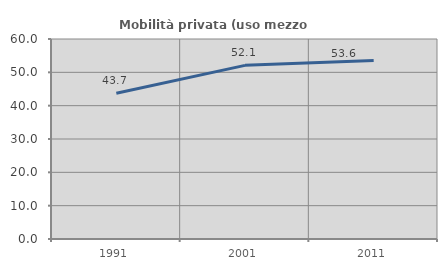
| Category | Mobilità privata (uso mezzo privato) |
|---|---|
| 1991.0 | 43.731 |
| 2001.0 | 52.096 |
| 2011.0 | 53.571 |